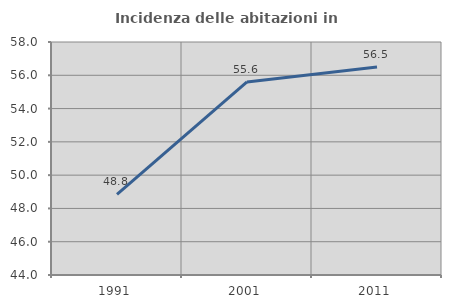
| Category | Incidenza delle abitazioni in proprietà  |
|---|---|
| 1991.0 | 48.844 |
| 2001.0 | 55.601 |
| 2011.0 | 56.503 |